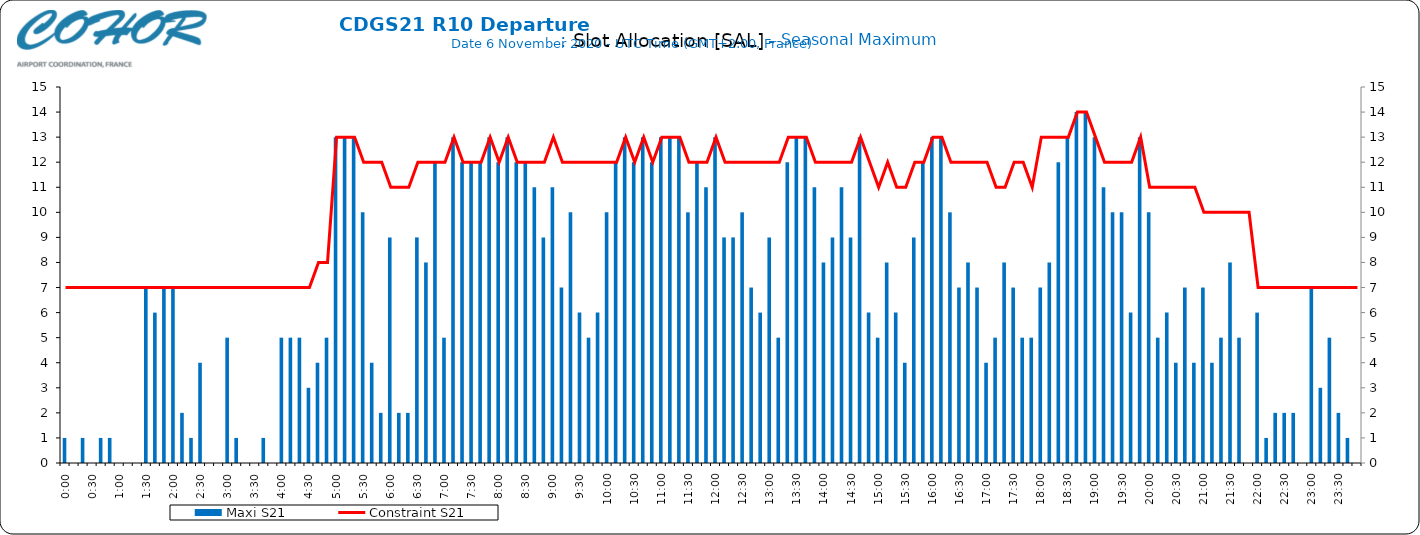
| Category | Maxi S21 |
|---|---|
| 0.0 | 1 |
| 0.006944444444444444 | 0 |
| 0.013888888888888888 | 1 |
| 0.020833333333333332 | 0 |
| 0.027777777777777776 | 1 |
| 0.034722222222222224 | 1 |
| 0.041666666666666664 | 0 |
| 0.04861111111111111 | 0 |
| 0.05555555555555555 | 0 |
| 0.0625 | 7 |
| 0.06944444444444443 | 6 |
| 0.0763888888888889 | 7 |
| 0.08333333333333333 | 7 |
| 0.09027777777777778 | 2 |
| 0.09722222222222222 | 1 |
| 0.10416666666666667 | 4 |
| 0.1111111111111111 | 0 |
| 0.11805555555555557 | 0 |
| 0.125 | 5 |
| 0.13194444444444445 | 1 |
| 0.1388888888888889 | 0 |
| 0.14583333333333334 | 0 |
| 0.15277777777777776 | 1 |
| 0.15972222222222224 | 0 |
| 0.16666666666666666 | 5 |
| 0.17361111111111113 | 5 |
| 0.18055555555555555 | 5 |
| 0.1875 | 3 |
| 0.19444444444444445 | 4 |
| 0.20138888888888887 | 5 |
| 0.20833333333333334 | 13 |
| 0.2152777777777778 | 13 |
| 0.2222222222222222 | 13 |
| 0.22916666666666666 | 10 |
| 0.23611111111111113 | 4 |
| 0.24305555555555555 | 2 |
| 0.25 | 9 |
| 0.2569444444444445 | 2 |
| 0.2638888888888889 | 2 |
| 0.2708333333333333 | 9 |
| 0.2777777777777778 | 8 |
| 0.2847222222222222 | 12 |
| 0.2916666666666667 | 5 |
| 0.2986111111111111 | 13 |
| 0.3055555555555555 | 12 |
| 0.3125 | 12 |
| 0.3194444444444445 | 12 |
| 0.3263888888888889 | 13 |
| 0.3333333333333333 | 12 |
| 0.34027777777777773 | 13 |
| 0.34722222222222227 | 12 |
| 0.3541666666666667 | 12 |
| 0.3611111111111111 | 11 |
| 0.3680555555555556 | 9 |
| 0.375 | 11 |
| 0.3819444444444444 | 7 |
| 0.3888888888888889 | 10 |
| 0.3958333333333333 | 6 |
| 0.40277777777777773 | 5 |
| 0.40972222222222227 | 6 |
| 0.4166666666666667 | 10 |
| 0.4236111111111111 | 12 |
| 0.4305555555555556 | 13 |
| 0.4375 | 12 |
| 0.4444444444444444 | 13 |
| 0.4513888888888889 | 12 |
| 0.4583333333333333 | 13 |
| 0.46527777777777773 | 13 |
| 0.47222222222222227 | 13 |
| 0.4791666666666667 | 10 |
| 0.4861111111111111 | 12 |
| 0.4930555555555556 | 11 |
| 0.5 | 13 |
| 0.5069444444444444 | 9 |
| 0.513888888888889 | 9 |
| 0.5208333333333334 | 10 |
| 0.5277777777777778 | 7 |
| 0.5347222222222222 | 6 |
| 0.5416666666666666 | 9 |
| 0.548611111111111 | 5 |
| 0.5555555555555556 | 12 |
| 0.5625 | 13 |
| 0.5694444444444444 | 13 |
| 0.576388888888889 | 11 |
| 0.5833333333333334 | 8 |
| 0.5902777777777778 | 9 |
| 0.5972222222222222 | 11 |
| 0.6041666666666666 | 9 |
| 0.611111111111111 | 13 |
| 0.6180555555555556 | 6 |
| 0.625 | 5 |
| 0.6319444444444444 | 8 |
| 0.638888888888889 | 6 |
| 0.6458333333333334 | 4 |
| 0.6527777777777778 | 9 |
| 0.6597222222222222 | 12 |
| 0.6666666666666666 | 13 |
| 0.6736111111111112 | 13 |
| 0.6805555555555555 | 10 |
| 0.6875 | 7 |
| 0.6944444444444445 | 8 |
| 0.7013888888888888 | 7 |
| 0.7083333333333334 | 4 |
| 0.7152777777777778 | 5 |
| 0.7222222222222222 | 8 |
| 0.7291666666666666 | 7 |
| 0.7361111111111112 | 5 |
| 0.7430555555555555 | 5 |
| 0.75 | 7 |
| 0.7569444444444445 | 8 |
| 0.7638888888888888 | 12 |
| 0.7708333333333334 | 13 |
| 0.7777777777777778 | 14 |
| 0.7847222222222222 | 14 |
| 0.7916666666666666 | 13 |
| 0.7986111111111112 | 11 |
| 0.8055555555555555 | 10 |
| 0.8125 | 10 |
| 0.8194444444444445 | 6 |
| 0.8263888888888888 | 13 |
| 0.8333333333333334 | 10 |
| 0.8402777777777778 | 5 |
| 0.8472222222222222 | 6 |
| 0.8541666666666666 | 4 |
| 0.8611111111111112 | 7 |
| 0.8680555555555555 | 4 |
| 0.875 | 7 |
| 0.8819444444444445 | 4 |
| 0.8888888888888888 | 5 |
| 0.8958333333333334 | 8 |
| 0.9027777777777778 | 5 |
| 0.9097222222222222 | 0 |
| 0.9166666666666666 | 6 |
| 0.9236111111111112 | 1 |
| 0.9305555555555555 | 2 |
| 0.9375 | 2 |
| 0.9444444444444445 | 2 |
| 0.9513888888888888 | 0 |
| 0.9583333333333334 | 7 |
| 0.9652777777777778 | 3 |
| 0.9722222222222222 | 5 |
| 0.9791666666666666 | 2 |
| 0.9861111111111112 | 1 |
| 0.9930555555555555 | 0 |